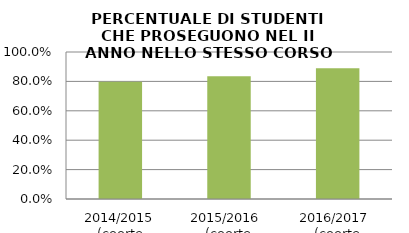
| Category | 2014/2015 (coorte 2013/14) 2015/2016  (coorte 2014/15) 2016/2017  (coorte 2015/16) |
|---|---|
| 2014/2015 (coorte 2013/14) | 0.798 |
| 2015/2016  (coorte 2014/15) | 0.835 |
| 2016/2017  (coorte 2015/16) | 0.889 |